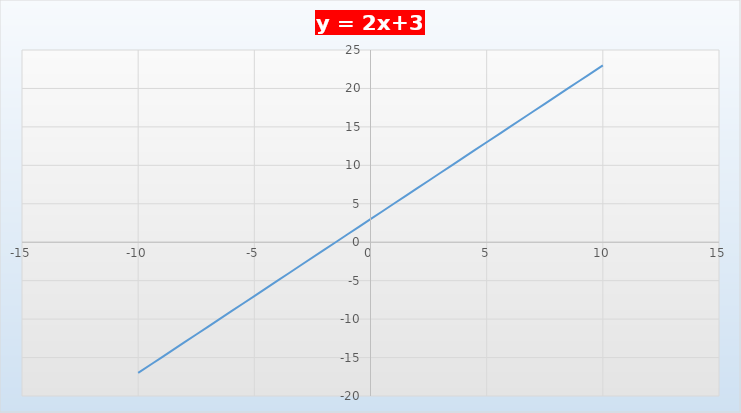
| Category | Series 0 |
|---|---|
| -10.0 | -17 |
| -9.0 | -15 |
| -8.0 | -13 |
| -7.0 | -11 |
| -6.0 | -9 |
| -5.0 | -7 |
| -4.0 | -5 |
| -3.0 | -3 |
| -2.0 | -1 |
| -1.0 | 1 |
| 0.0 | 3 |
| 1.0 | 5 |
| 2.0 | 7 |
| 3.0 | 9 |
| 4.0 | 11 |
| 5.0 | 13 |
| 6.0 | 15 |
| 7.0 | 17 |
| 8.0 | 19 |
| 9.0 | 21 |
| 10.0 | 23 |